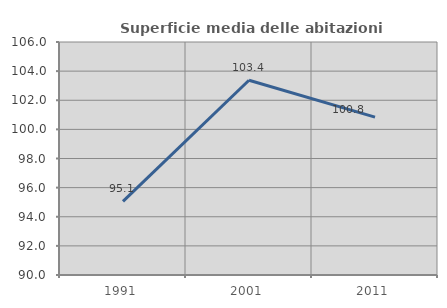
| Category | Superficie media delle abitazioni occupate |
|---|---|
| 1991.0 | 95.055 |
| 2001.0 | 103.376 |
| 2011.0 | 100.844 |